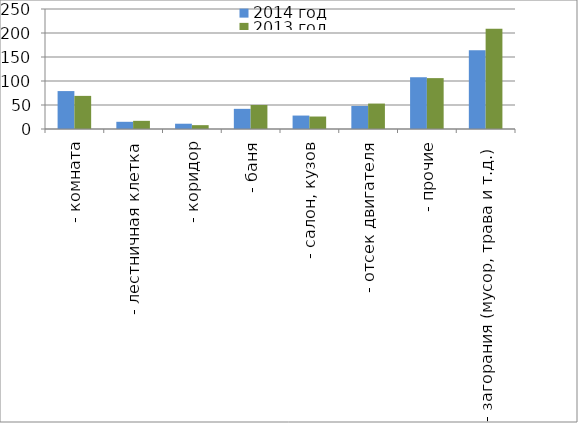
| Category | 2014 год | 2013 год |
|---|---|---|
|  - комната | 79 | 69 |
|  - лестничная клетка | 15 | 17 |
|  - коридор | 11 | 8 |
|  - баня | 42 | 50 |
|  - салон, кузов | 28 | 26 |
|  - отсек двигателя | 48 | 53 |
| - прочие | 108 | 106 |
| - загорания (мусор, трава и т.д.)  | 164 | 209 |